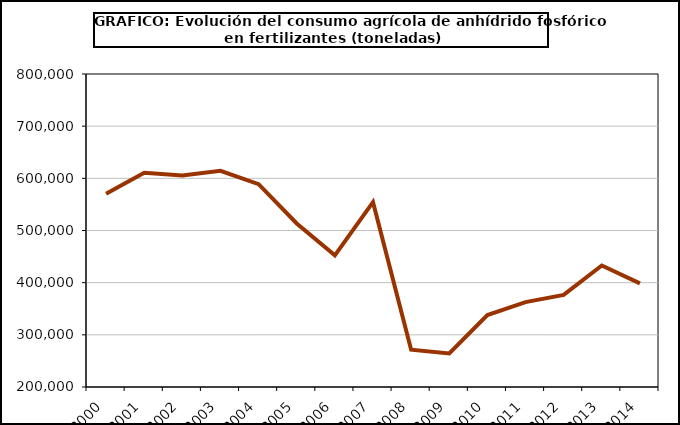
| Category | fertilizantes |
|---|---|
| 2000.0 | 570282 |
| 2001.0 | 610838 |
| 2002.0 | 605224 |
| 2003.0 | 614385 |
| 2004.0 | 588820 |
| 2005.0 | 513454 |
| 2006.0 | 452461 |
| 2007.0 | 554382 |
| 2008.0 | 271578 |
| 2009.0 | 264211 |
| 2010.0 | 337812 |
| 2011.0 | 362672 |
| 2012.0 | 376590 |
| 2013.0 | 432904 |
| 2014.0 | 398580 |